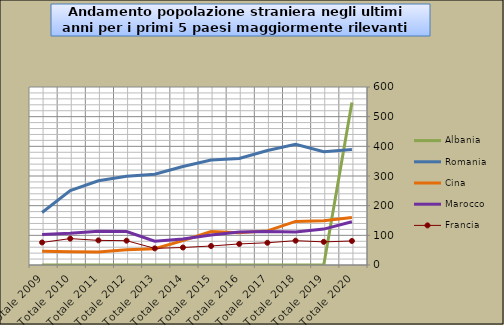
| Category | Series 1 | Albania | Romania | Cina | Marocco | Francia |
|---|---|---|---|---|---|---|
| Totale 2020 |  | 548 | 389 | 160 | 146 | 81 |
| Totale 2019 |  | 0 | 382 | 149 | 121 | 78 |
| Totale 2018 |  | 0 | 407 | 147 | 111 | 82 |
| Totale 2017 |  | 0 | 386 | 115 | 113 | 75 |
| Totale 2016 |  | 0 | 359 | 109 | 111 | 71 |
| Totale 2015 |  | 0 | 354 | 113 | 101 | 64 |
| Totale 2014 |  | 0 | 332 | 82 | 88 | 59 |
| Totale 2013 |  | 0 | 306 | 55 | 80 | 56 |
| Totale 2012 |  | 0 | 299 | 51 | 113 | 82 |
| Totale 2011 |  | 0 | 284 | 44 | 114 | 83 |
| Totale 2010 |  | 0 | 251 | 45 | 107 | 89 |
| Totale 2009 |  | 0 | 177 | 46 | 103 | 76 |